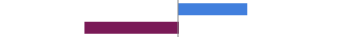
| Category | Series 0 |
|---|---|
| Favorable | 0.386 |
| Unfavorable | -0.529 |